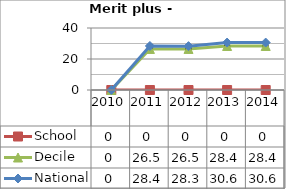
| Category | School  | Decile | National |
|---|---|---|---|
| 2010.0 | 0 | 0 | 0 |
| 2011.0 | 0 | 26.5 | 28.4 |
| 2012.0 | 0 | 26.5 | 28.3 |
| 2013.0 | 0 | 28.4 | 30.6 |
| 2014.0 | 0 | 28.4 | 30.6 |